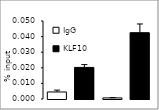
| Category | IgG | KLF10 |
|---|---|---|
| IgG | 0.005 | 0.02 |